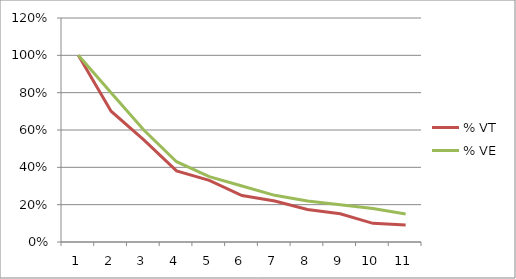
| Category | % VT | % VE |
|---|---|---|
| 0 | 1 | 1 |
| 1 | 0.701 | 0.8 |
| 2 | 0.547 | 0.6 |
| 3 | 0.381 | 0.43 |
| 4 | 0.33 | 0.35 |
| 5 | 0.249 | 0.3 |
| 6 | 0.219 | 0.25 |
| 7 | 0.175 | 0.22 |
| 8 | 0.151 | 0.2 |
| 9 | 0.1 | 0.18 |
| 10 | 0.091 | 0.15 |